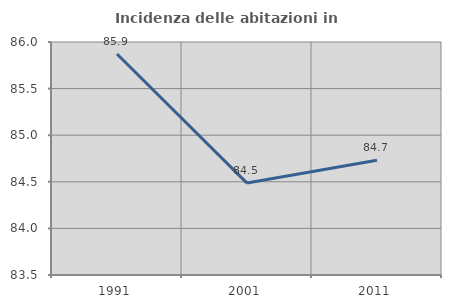
| Category | Incidenza delle abitazioni in proprietà  |
|---|---|
| 1991.0 | 85.871 |
| 2001.0 | 84.486 |
| 2011.0 | 84.731 |